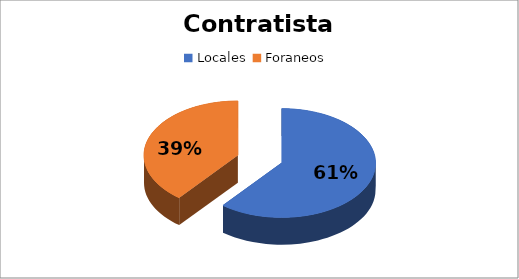
| Category | Suma |
|---|---|
| Locales  | 49353300.17 |
| Foraneos  | 31898523.55 |